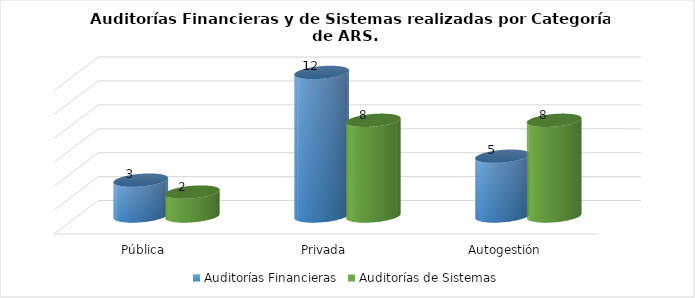
| Category | Auditorías Financieras | Auditorías de Sistemas |
|---|---|---|
| Pública | 3 | 2 |
| Privada | 12 | 8 |
| Autogestión | 5 | 8 |